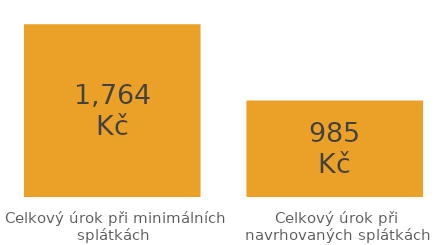
| Category | Series 0 |
|---|---|
| Celkový úrok při minimálních splátkách | 1763.952 |
| Celkový úrok při navrhovaných splátkách | 984.811 |